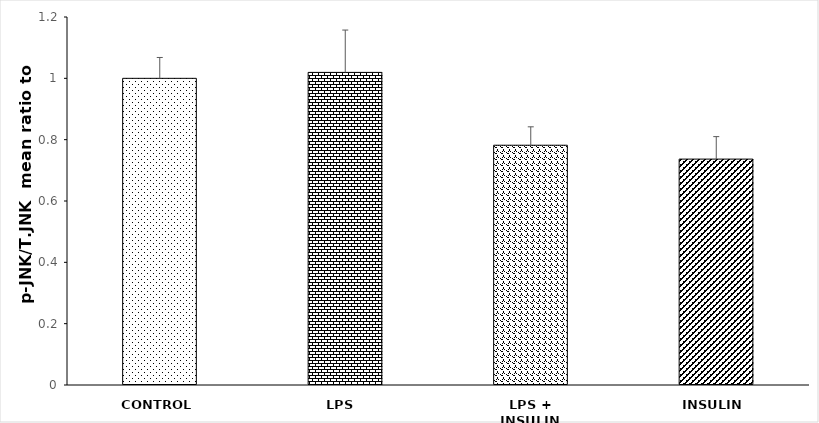
| Category | Series 0 |
|---|---|
| CONTROL | 1 |
| LPS  | 1.019 |
| LPS + INSULIN | 0.782 |
| INSULIN | 0.737 |